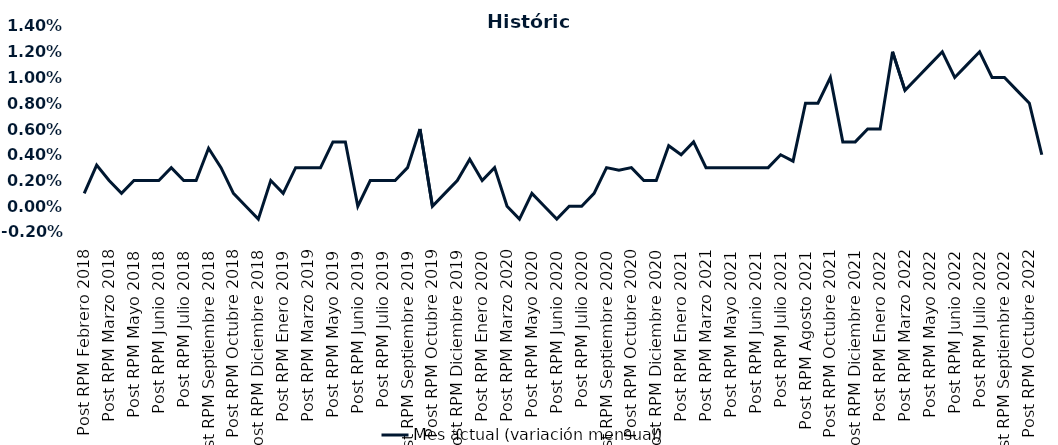
| Category | Mes actual (variación mensual)  |
|---|---|
| Post RPM Febrero 2018 | 0.001 |
| Pre RPM Marzo 2018 | 0.003 |
| Post RPM Marzo 2018 | 0.002 |
| Pre RPM Mayo 2018 | 0.001 |
| Post RPM Mayo 2018 | 0.002 |
| Pre RPM Junio 2018 | 0.002 |
| Post RPM Junio 2018 | 0.002 |
| Pre RPM Julio 2018 | 0.003 |
| Post RPM Julio 2018 | 0.002 |
| Pre RPM Septiembre 2018 | 0.002 |
| Post RPM Septiembre 2018 | 0.004 |
| Pre RPM Octubre 2018 | 0.003 |
| Post RPM Octubre 2018 | 0.001 |
| Pre RPM Diciembre 2018 | 0 |
| Post RPM Diciembre 2018 | -0.001 |
| Pre RPM Enero 2019 | 0.002 |
| Post RPM Enero 2019 | 0.001 |
| Pre RPM Marzo 2019 | 0.003 |
| Post RPM Marzo 2019 | 0.003 |
| Pre RPM Mayo 2019 | 0.003 |
| Post RPM Mayo 2019 | 0.005 |
| Pre RPM Junio 2019 | 0.005 |
| Post RPM Junio 2019 | 0 |
| Pre RPM Julio 2019 | 0.002 |
| Post RPM Julio 2019 | 0.002 |
| Pre RPM Septiembre 2019 | 0.002 |
| Post RPM Septiembre 2019 | 0.003 |
| Pre RPM Octubre 2019 | 0.006 |
| Post RPM Octubre 2019 | 0 |
| Pre RPM Diciembre 2019 | 0.001 |
| Post RPM Diciembre 2019 | 0.002 |
| Pre RPM Enero 2020 | 0.004 |
| Post RPM Enero 2020 | 0.002 |
| Pre RPM Marzo 2020 | 0.003 |
| Post RPM Marzo 2020 | 0 |
| Pre RPM Mayo 2020 | -0.001 |
| Post RPM Mayo 2020 | 0.001 |
| Pre RPM Junio 2020 | 0 |
| Post RPM Junio 2020 | -0.001 |
| Pre RPM Julio 2020 | 0 |
| Post RPM Julio 2020 | 0 |
| Pre RPM Septiembre 2020 | 0.001 |
| Post RPM Septiembre 2020 | 0.003 |
| Pre RPM Octubre 2020 | 0.003 |
| Post RPM Octubre 2020 | 0.003 |
| Pre RPM Diciembre 2020 | 0.002 |
| Post RPM Diciembre 2020 | 0.002 |
| Pre RPM Enero 2021 | 0.005 |
| Post RPM Enero 2021 | 0.004 |
| Pre RPM Marzo 2021 | 0.005 |
| Post RPM Marzo 2021 | 0.003 |
| Pre RPM Mayo 2021 | 0.003 |
| Post RPM Mayo 2021 | 0.003 |
| Pre RPM Junio 2021 | 0.003 |
| Post RPM Junio 2021 | 0.003 |
| Pre RPM Julio 2021 | 0.003 |
| Post RPM Julio 2021 | 0.004 |
| Pre RPM Agosto 2021 | 0.004 |
| Post RPM Agosto 2021 | 0.008 |
| Pre RPM Octubre 2021 | 0.008 |
| Post RPM Octubre 2021 | 0.01 |
| Pre RPM Diciembre 2021 | 0.005 |
| Post RPM Diciembre 2021 | 0.005 |
| Pre RPM Enero 2022 | 0.006 |
| Post RPM Enero 2022 | 0.006 |
| Pre RPM Marzo 2022 | 0.012 |
| Post RPM Marzo 2022 | 0.009 |
| Pre RPM Mayo 2022 | 0.01 |
| Post RPM Mayo 2022 | 0.011 |
| Pre RPM Junio 2022 | 0.012 |
| Post RPM Junio 2022 | 0.01 |
| Pre RPM Julio 2022 | 0.011 |
| Post RPM Julio 2022 | 0.012 |
| Pre RPM Septiembre 2022 | 0.01 |
| Post RPM Septiembre 2022 | 0.01 |
| Pre RPM Octubre 2022 | 0.009 |
| Post RPM Octubre 2022 | 0.008 |
| Pre RPM Diciembre 2022 | 0.004 |